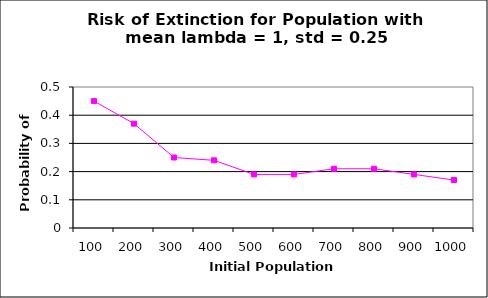
| Category | Series 1 |
|---|---|
| 100.0 | 0.45 |
| 200.0 | 0.37 |
| 300.0 | 0.25 |
| 400.0 | 0.24 |
| 500.0 | 0.19 |
| 600.0 | 0.19 |
| 700.0 | 0.21 |
| 800.0 | 0.21 |
| 900.0 | 0.19 |
| 1000.0 | 0.17 |